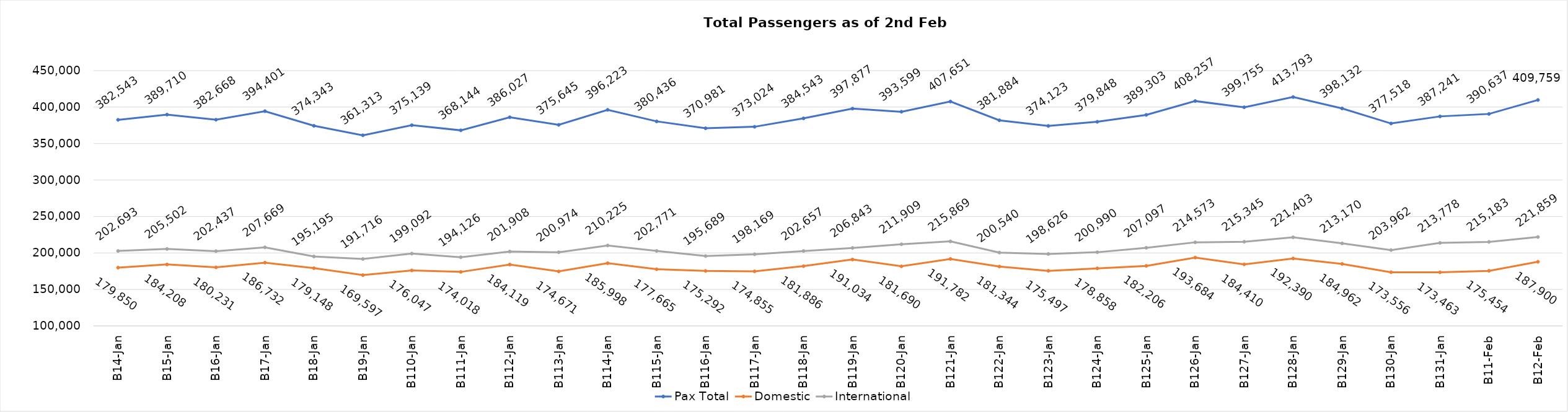
| Category | Pax Total | Domestic | International |
|---|---|---|---|
| 2024-01-04 | 382543 | 179850 | 202693 |
| 2024-01-05 | 389710 | 184208 | 205502 |
| 2024-01-06 | 382668 | 180231 | 202437 |
| 2024-01-07 | 394401 | 186732 | 207669 |
| 2024-01-08 | 374343 | 179148 | 195195 |
| 2024-01-09 | 361313 | 169597 | 191716 |
| 2024-01-10 | 375139 | 176047 | 199092 |
| 2024-01-11 | 368144 | 174018 | 194126 |
| 2024-01-12 | 386027 | 184119 | 201908 |
| 2024-01-13 | 375645 | 174671 | 200974 |
| 2024-01-14 | 396223 | 185998 | 210225 |
| 2024-01-15 | 380436 | 177665 | 202771 |
| 2024-01-16 | 370981 | 175292 | 195689 |
| 2024-01-17 | 373024 | 174855 | 198169 |
| 2024-01-18 | 384543 | 181886 | 202657 |
| 2024-01-19 | 397877 | 191034 | 206843 |
| 2024-01-20 | 393599 | 181690 | 211909 |
| 2024-01-21 | 407651 | 191782 | 215869 |
| 2024-01-22 | 381884 | 181344 | 200540 |
| 2024-01-23 | 374123 | 175497 | 198626 |
| 2024-01-24 | 379848 | 178858 | 200990 |
| 2024-01-25 | 389303 | 182206 | 207097 |
| 2024-01-26 | 408257 | 193684 | 214573 |
| 2024-01-27 | 399755 | 184410 | 215345 |
| 2024-01-28 | 413793 | 192390 | 221403 |
| 2024-01-29 | 398132 | 184962 | 213170 |
| 2024-01-30 | 377518 | 173556 | 203962 |
| 2024-01-31 | 387241 | 173463 | 213778 |
| 2024-02-01 | 390637 | 175454 | 215183 |
| 2024-02-02 | 409759 | 187900 | 221859 |